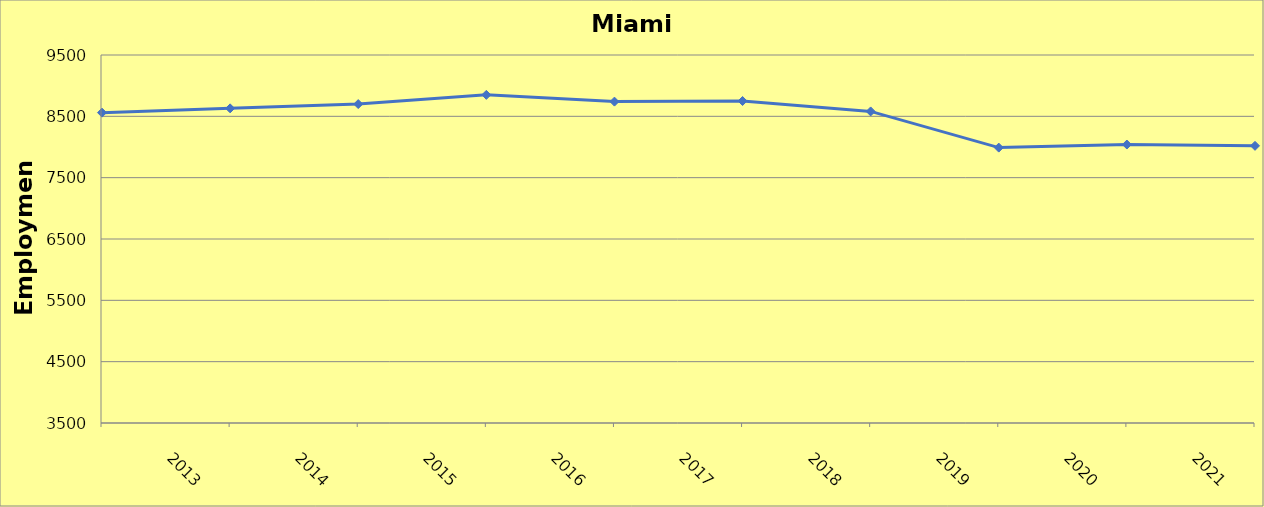
| Category | Miami County |
|---|---|
| 2013.0 | 8560 |
| 2014.0 | 8630 |
| 2015.0 | 8700 |
| 2016.0 | 8850 |
| 2017.0 | 8740 |
| 2018.0 | 8750 |
| 2019.0 | 8580 |
| 2020.0 | 7990 |
| 2021.0 | 8040 |
| 2022.0 | 8019 |